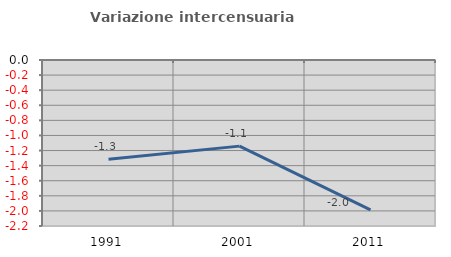
| Category | Variazione intercensuaria annua |
|---|---|
| 1991.0 | -1.315 |
| 2001.0 | -1.141 |
| 2011.0 | -1.987 |